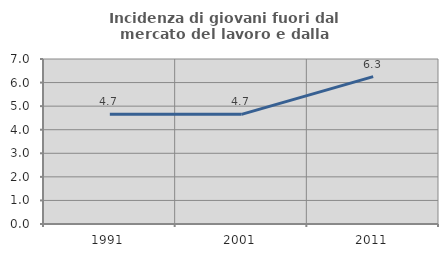
| Category | Incidenza di giovani fuori dal mercato del lavoro e dalla formazione  |
|---|---|
| 1991.0 | 4.651 |
| 2001.0 | 4.651 |
| 2011.0 | 6.25 |